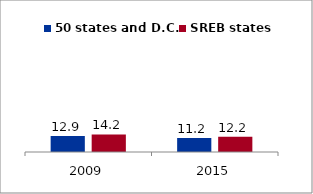
| Category | 50 states and D.C. | SREB states |
|---|---|---|
| 2009.0 | 12.896 | 14.203 |
| 2015.0 | 11.234 | 12.242 |